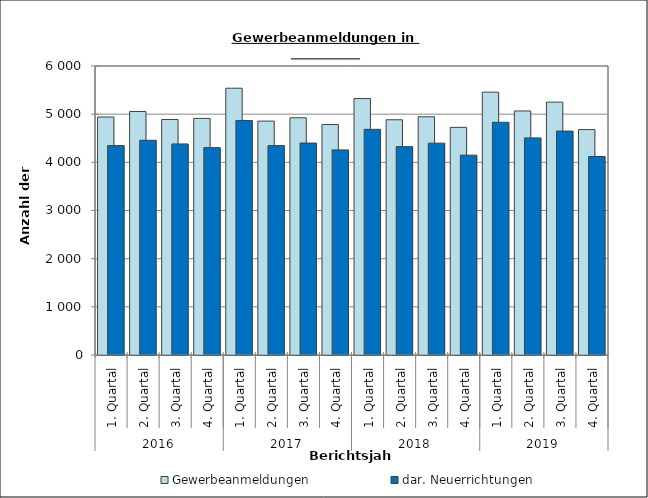
| Category | Gewerbeanmeldungen | dar. Neuerrichtungen |
|---|---|---|
| 0 | 4941 | 4347 |
| 1 | 5056 | 4458 |
| 2 | 4889 | 4382 |
| 3 | 4912 | 4305 |
| 4 | 5539 | 4869 |
| 5 | 4856 | 4347 |
| 6 | 4925 | 4400 |
| 7 | 4785 | 4258 |
| 8 | 5324 | 4685 |
| 9 | 4884 | 4326 |
| 10 | 4946 | 4398 |
| 11 | 4726 | 4149 |
| 12 | 5457 | 4831 |
| 13 | 5067 | 4507 |
| 14 | 5250 | 4649 |
| 15 | 4680 | 4121 |